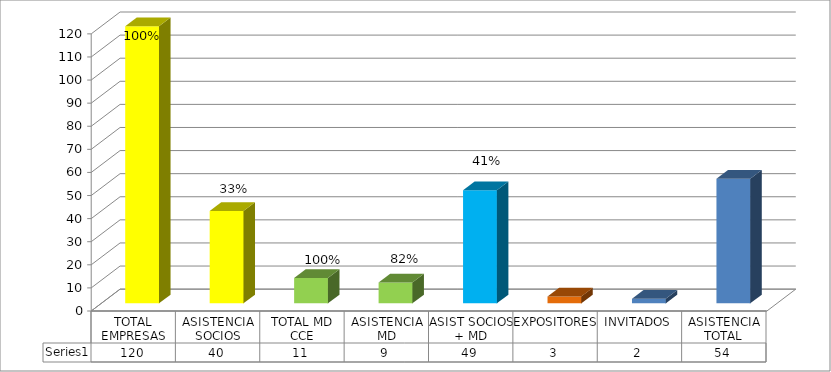
| Category | Series 0 |
|---|---|
| TOTAL EMPRESAS | 120 |
| ASISTENCIA SOCIOS | 40 |
| TOTAL MD CCE | 11 |
| ASISTENCIA MD | 9 |
| ASIST SOCIOS + MD | 49 |
| EXPOSITORES | 3 |
| INVITADOS | 2 |
| ASISTENCIA TOTAL | 54 |